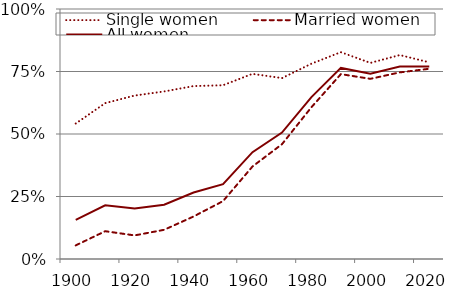
| Category | Single women | Married women | All women |
|---|---|---|---|
| 1900.0 | 0.542 | 0.054 | 0.157 |
| 1910.0 | 0.623 | 0.111 | 0.215 |
| 1920.0 | 0.654 | 0.094 | 0.202 |
| 1930.0 | 0.67 | 0.117 | 0.217 |
| 1940.0 | 0.692 | 0.17 | 0.266 |
| 1950.0 | 0.695 | 0.232 | 0.299 |
| 1960.0 | 0.741 | 0.37 | 0.427 |
| 1970.0 | 0.724 | 0.459 | 0.506 |
| 1980.0 | 0.781 | 0.607 | 0.648 |
| 1990.0 | 0.827 | 0.739 | 0.764 |
| 2000.0 | 0.784 | 0.721 | 0.741 |
| 2010.0 | 0.816 | 0.746 | 0.77 |
| 2020.0 | 0.787 | 0.761 | 0.77 |